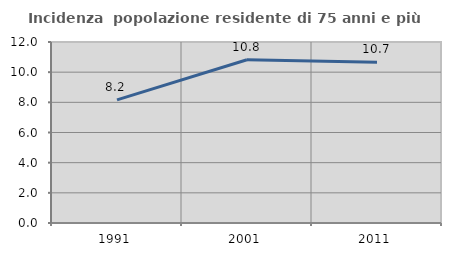
| Category | Incidenza  popolazione residente di 75 anni e più |
|---|---|
| 1991.0 | 8.16 |
| 2001.0 | 10.827 |
| 2011.0 | 10.654 |